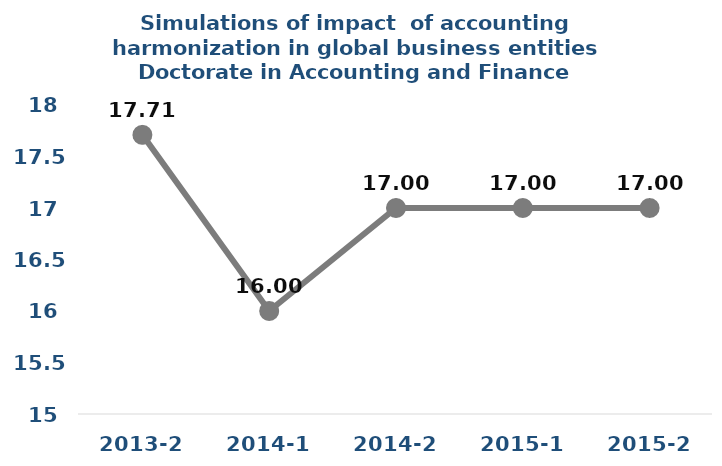
| Category | Series 0 |
|---|---|
| 2013-2 | 17.71 |
| 2014-1 | 16 |
| 2014-2 | 17 |
| 2015-1 | 17 |
| 2015-2 | 17 |